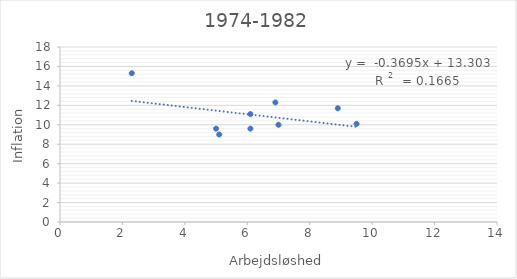
| Category | Series 0 |
|---|---|
| 2.3 | 15.3 |
| 5.0 | 9.6 |
| 5.1 | 9 |
| 6.1 | 11.1 |
| 7.0 | 10 |
| 6.1 | 9.6 |
| 6.9 | 12.3 |
| 8.9 | 11.7 |
| 9.5 | 10.1 |